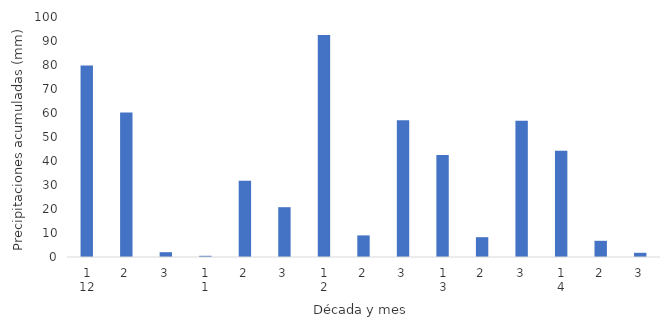
| Category | Series 0 |
|---|---|
| 0 | 79.75 |
| 1 | 60.25 |
| 2 | 2 |
| 3 | 0.5 |
| 4 | 31.75 |
| 5 | 20.75 |
| 6 | 92.5 |
| 7 | 9 |
| 8 | 57 |
| 9 | 42.5 |
| 10 | 8.25 |
| 11 | 56.75 |
| 12 | 44.25 |
| 13 | 6.75 |
| 14 | 1.75 |